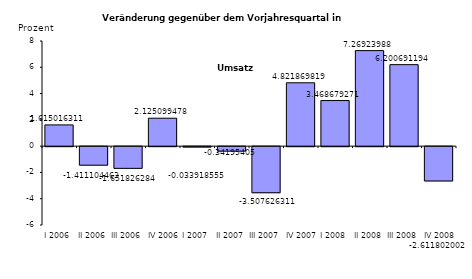
| Category | Series 0 |
|---|---|
| I 2006 | 1.615 |
| II 2006 | -1.411 |
| III 2006 | -1.652 |
| IV 2006 | 2.125 |
| I 2007 | -0.034 |
| II 2007 | -0.342 |
| III 2007 | -3.508 |
| IV 2007 | 4.822 |
| I 2008 | 3.469 |
| II 2008 | 7.269 |
| III 2008 | 6.201 |
| IV 2008 | -2.612 |